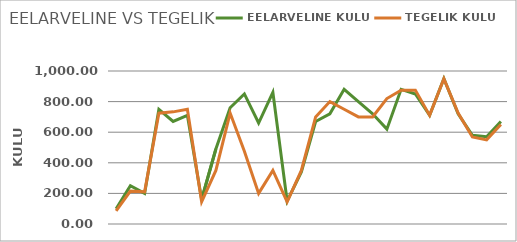
| Category | EELARVELINE KULU | TEGELIK KULU |
|---|---|---|
| 0 | 100 | 85 |
| 1 | 250 | 215 |
| 2 | 200 | 210 |
| 3 | 750 | 724 |
| 4 | 670 | 733 |
| 5 | 710 | 750 |
| 6 | 160 | 145 |
| 7 | 490 | 350 |
| 8 | 760 | 725 |
| 9 | 850 | 475 |
| 10 | 660 | 200 |
| 11 | 860 | 350 |
| 12 | 150 | 144 |
| 13 | 340 | 350 |
| 14 | 670 | 700 |
| 15 | 720 | 800 |
| 16 | 880 | 750 |
| 17 | 800 | 700 |
| 18 | 720 | 700 |
| 19 | 620 | 820 |
| 20 | 880 | 875 |
| 21 | 850 | 875 |
| 22 | 710 | 710 |
| 23 | 950 | 949 |
| 24 | 720 | 725 |
| 25 | 580 | 569 |
| 26 | 570 | 550 |
| 27 | 670 | 650 |